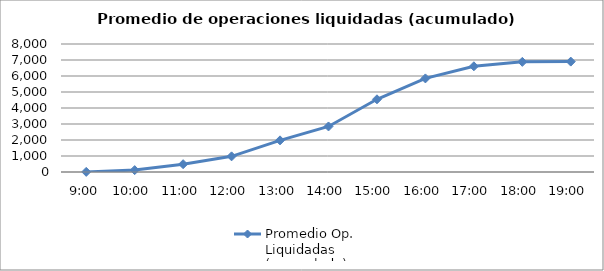
| Category | Promedio Op.
Liquidadas 
(acumulado) |
|---|---|
| 0.375 | 7.333 |
| 0.4166666666666667 | 117.905 |
| 0.4583333333333333 | 488.619 |
| 0.5 | 977.952 |
| 0.5416666666666666 | 1978.143 |
| 0.583333333333333 | 2846.524 |
| 0.625 | 4543.905 |
| 0.666666666666667 | 5849.333 |
| 0.708333333333333 | 6607 |
| 0.75 | 6883.571 |
| 0.791666666666667 | 6900.286 |